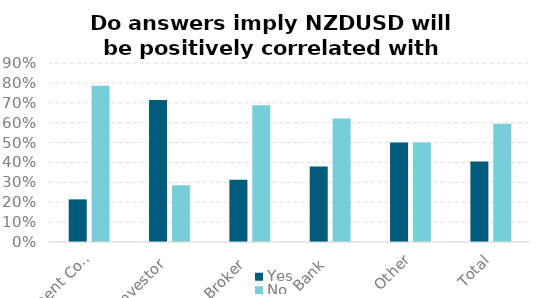
| Category | Yes | No |
|---|---|---|
| Investment Consultant | 0.214 | 0.786 |
| Investor | 0.714 | 0.286 |
| Broker | 0.312 | 0.688 |
| Bank | 0.379 | 0.621 |
| Other | 0.5 | 0.5 |
| Total | 0.405 | 0.595 |